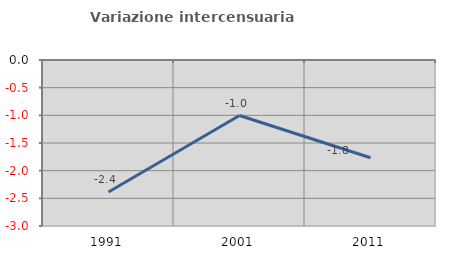
| Category | Variazione intercensuaria annua |
|---|---|
| 1991.0 | -2.385 |
| 2001.0 | -1.004 |
| 2011.0 | -1.767 |